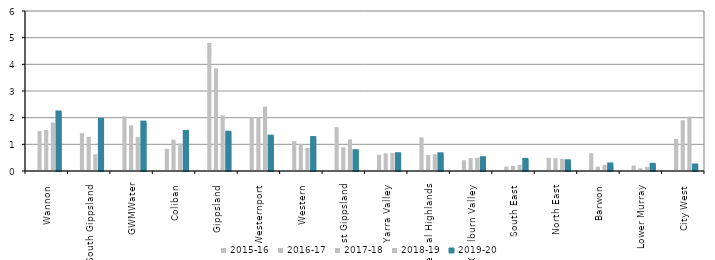
| Category | 2015-16 | 2016-17 | 2017-18 | 2018-19 | 2019-20 |
|---|---|---|---|---|---|
| Wannon  | 0 | 1.497 | 1.542 | 1.824 | 2.194 |
| South Gippsland  | 0 | 1.417 | 1.284 | 0.625 | 1.915 |
| GWMWater | 0 | 2.046 | 1.71 | 1.28 | 1.815 |
| Coliban  | 0 | 0.832 | 1.175 | 1.03 | 1.465 |
| Gippsland  | 0 | 4.804 | 3.849 | 2.084 | 1.436 |
| Westernport  | 0 | 2.015 | 2.011 | 2.411 | 1.288 |
| Western  | 0 | 1.123 | 1.009 | 0.863 | 1.235 |
| East Gippsland  | 0 | 1.647 | 0.885 | 1.187 | 0.743 |
| Yarra Valley  | 0 | 0.61 | 0.661 | 0.681 | 0.629 |
| Central Highlands  | 0 | 1.257 | 0.605 | 0.63 | 0.626 |
| Goulburn Valley  | 0 | 0.406 | 0.482 | 0.499 | 0.481 |
| South East  | 0 | 0.166 | 0.192 | 0.229 | 0.417 |
| North East  | 0 | 0.499 | 0.479 | 0.454 | 0.364 |
| Barwon  | 0 | 0.665 | 0.164 | 0.234 | 0.245 |
| Lower Murray  | 0 | 0.208 | 0.104 | 0.155 | 0.232 |
| City West  | 0 | 1.204 | 1.904 | 2.043 | 0.207 |